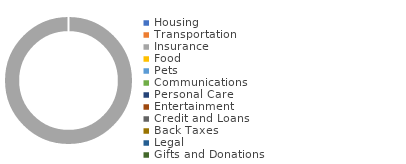
| Category | Expenses |
|---|---|
| Housing | 0 |
| Transportation | 0 |
| Insurance | 1 |
| Food | 0 |
| Pets | 0 |
| Communications | 0 |
| Personal Care | 0 |
| Entertainment | 0 |
| Credit and Loans | 0 |
| Back Taxes | 0 |
| Legal  | 0 |
| Gifts and Donations | 0 |